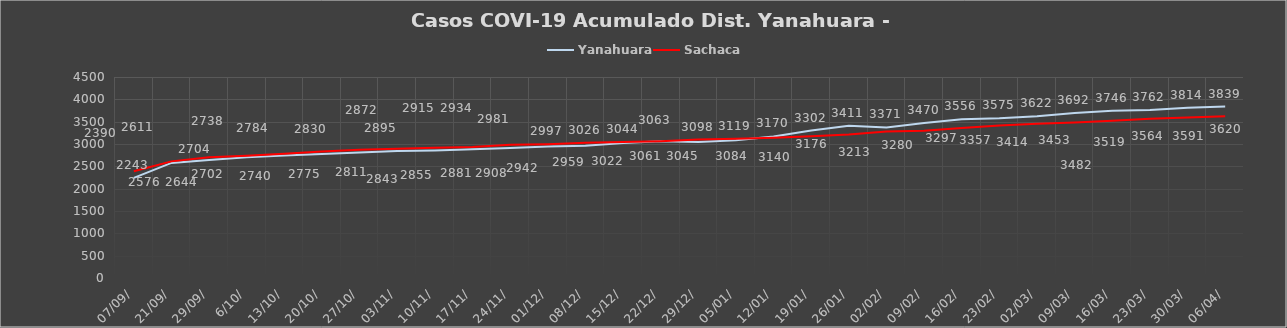
| Category | Yanahuara | Sachaca |
|---|---|---|
| 07/09/ | 2243 | 2390 |
| 21/09/ | 2576 | 2611 |
| 29/09/ | 2644 | 2704 |
| 6/10/ | 2702 | 2738 |
| 13/10/ | 2740 | 2784 |
| 20/10/ | 2775 | 2830 |
| 27/10/ | 2811 | 2872 |
| 03/11/ | 2843 | 2895 |
| 10/11/ | 2855 | 2915 |
| 17/11/ | 2881 | 2934 |
| 24/11/ | 2908 | 2981 |
| 01/12/ | 2942 | 2997 |
| 08/12/ | 2959 | 3026 |
| 15/12/ | 3022 | 3044 |
| 22/12/ | 3061 | 3063 |
| 29/12/ | 3045 | 3098 |
| 05/01/ | 3084 | 3119 |
| 12/01/ | 3170 | 3140 |
| 19/01/ | 3302 | 3176 |
| 26/01/ | 3411 | 3213 |
| 02/02/ | 3371 | 3280 |
| 09/02/ | 3470 | 3297 |
| 16/02/ | 3556 | 3357 |
| 23/02/ | 3575 | 3414 |
| 02/03/ | 3622 | 3453 |
| 09/03/ | 3692 | 3482 |
| 16/03/ | 3746 | 3519 |
| 23/03/ | 3762 | 3564 |
| 30/03/ | 3814 | 3591 |
| 06/04/ | 3839 | 3620 |